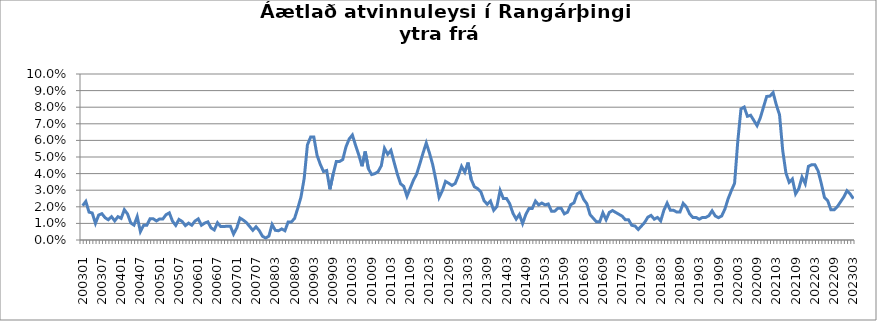
| Category | Series 0 |
|---|---|
| 200301 | 0.021 |
| 200302 | 0.023 |
| 200303 | 0.017 |
| 200304 | 0.016 |
| 200305 | 0.01 |
| 200306 | 0.015 |
| 200307 | 0.016 |
| 200308 | 0.013 |
| 200309 | 0.012 |
| 200310 | 0.014 |
| 200311 | 0.012 |
| 200312 | 0.014 |
| 200401 | 0.013 |
| 200402 | 0.018 |
| 200403 | 0.016 |
| 200404 | 0.01 |
| 200405 | 0.009 |
| 200406 | 0.014 |
| 200407 | 0.005 |
| 200408 | 0.009 |
| 200409 | 0.009 |
| 200410 | 0.013 |
| 200411 | 0.013 |
| 200412 | 0.011 |
| 200501 | 0.013 |
| 200502 | 0.013 |
| 200503 | 0.015 |
| 200504 | 0.016 |
| 200505 | 0.011 |
| 200506 | 0.009 |
| 200507 | 0.012 |
| 200508 | 0.011 |
| 200509 | 0.009 |
| 200510 | 0.01 |
| 200511 | 0.009 |
| 200512 | 0.011 |
| 200601 | 0.013 |
| 200602 | 0.009 |
| 200603 | 0.01 |
| 200604 | 0.011 |
| 200605 | 0.007 |
| 200606 | 0.006 |
| 200607 | 0.01 |
| 200608 | 0.008 |
| 200609 | 0.008 |
| 200610 | 0.008 |
| 200611 | 0.008 |
| 200612 | 0.004 |
| 200701 | 0.007 |
| 200702 | 0.013 |
| 200703 | 0.012 |
| 200704 | 0.011 |
| 200705 | 0.008 |
| 200706 | 0.006 |
| 200707 | 0.008 |
| 200708 | 0.006 |
| 200709 | 0.002 |
| 200710 | 0.001 |
| 200801 | 0.002 |
| 200802 | 0.009 |
| 200803 | 0.006 |
| 200804 | 0.006 |
| 200805 | 0.007 |
| 200806 | 0.006 |
| 200807 | 0.011 |
| 200808 | 0.011 |
| 200809 | 0.013 |
| 200810 | 0.019 |
| 200811 | 0.026 |
| 200812 | 0.037 |
| 200901 | 0.057 |
| 200902 | 0.062 |
| 200903 | 0.062 |
| 200904 | 0.051 |
| 200905 | 0.046 |
| 200906 | 0.041 |
| 200907 | 0.042 |
| 200908 | 0.031 |
| 200909 | 0.04 |
| 200910 | 0.047 |
| 200911 | 0.047 |
| 200912 | 0.048 |
| 201001 | 0.056 |
| 201002 | 0.061 |
| 201003 | 0.063 |
| 201004 | 0.057 |
| 201005 | 0.051 |
| 201006 | 0.044 |
| 201007 | 0.053 |
| 201008 | 0.043 |
| 201009 | 0.039 |
| 201010 | 0.04 |
| 201011 | 0.041 |
| 201012 | 0.045 |
| 201101 | 0.055 |
| 201102 | 0.052 |
| 201103 | 0.054 |
| 201104 | 0.047 |
| 201105 | 0.04 |
| 201106 | 0.034 |
| 201107 | 0.032 |
| 201108 | 0.026 |
| 201109 | 0.031 |
| 201110 | 0.036 |
| 201111 | 0.04 |
| 201112 | 0.046 |
| 201201 | 0.052 |
| 201202 | 0.058 |
| 201203 | 0.052 |
| 201204 | 0.045 |
| 201205 | 0.036 |
| 201206 | 0.026 |
| 201207 | 0.03 |
| 201208 | 0.035 |
| 201209 | 0.034 |
| 201210 | 0.033 |
| 201211 | 0.034 |
| 201212 | 0.039 |
| 201301 | 0.044 |
| 201302 | 0.041 |
| 201303 | 0.047 |
| 201304 | 0.036 |
| 201305 | 0.032 |
| 201306 | 0.031 |
| 201307 | 0.029 |
| 201308 | 0.024 |
| 201309 | 0.022 |
| 201310 | 0.023 |
| 201311 | 0.018 |
| 201312 | 0.02 |
| 201401 | 0.03 |
| 201402 | 0.025 |
| 201403 | 0.025 |
| 201404 | 0.022 |
| 201405 | 0.016 |
| 201406 | 0.013 |
| 201407 | 0.015 |
| 201408 | 0.01 |
| 201409 | 0.015 |
| 201410 | 0.019 |
| 201411 | 0.019 |
| 201412 | 0.023 |
| 201501 | 0.021 |
| 201502 | 0.022 |
| 201503 | 0.021 |
| 201504 | 0.022 |
| 201505 | 0.017 |
| 201506 | 0.017 |
| 201507 | 0.019 |
| 201508 | 0.019 |
| 201509 | 0.016 |
| 201510 | 0.017 |
| 201511 | 0.021 |
| 201512 | 0.022 |
| 201601 | 0.028 |
| 201602 | 0.029 |
| 201603 | 0.024 |
| 201604 | 0.022 |
| 201605 | 0.015 |
| 201606 | 0.013 |
| 201607 | 0.011 |
| 201608 | 0.011 |
| 201609 | 0.016 |
| 201610 | 0.012 |
| 201611 | 0.017 |
| 201612 | 0.018 |
| 201701 | 0.017 |
| 201702 | 0.015 |
| 201703 | 0.014 |
| 201704 | 0.012 |
| 201705 | 0.012 |
| 201706 | 0.009 |
| 201707 | 0.008 |
| 201708 | 0.006 |
| 201709 | 0.008 |
| 201710 | 0.011 |
| 201711 | 0.014 |
| 201712 | 0.015 |
| 201801 | 0.013 |
| 201802 | 0.014 |
| 201803 | 0.012 |
| 201804 | 0.018 |
| 201805 | 0.022 |
| 201806 | 0.018 |
| 201807 | 0.018 |
| 201808 | 0.017 |
| 201809 | 0.017 |
| 201810 | 0.022 |
| 201811 | 0.02 |
| 201812 | 0.016 |
| 201901 | 0.014 |
| 201902 | 0.014 |
| 201903 | 0.013 |
| 201904 | 0.014 |
| 201905 | 0.014 |
| 201906 | 0.015 |
| 201907 | 0.018 |
| 201908 | 0.014 |
| 201909 | 0.013 |
| 201910 | 0.015 |
| 201911 | 0.019 |
| 201912 | 0.025 |
| 202001 | 0.03 |
| 202002 | 0.034 |
| 202003 | 0.059 |
| 202004 | 0.079 |
| 202005 | 0.08 |
| 202006 | 0.075 |
| 202007 | 0.075 |
| 202008 | 0.072 |
| 202009 | 0.069 |
| 202010 | 0.074 |
| 202011 | 0.08 |
| 202012 | 0.086 |
| 202101 | 0.087 |
| 202102 | 0.089 |
| 202103 | 0.081 |
| 202104 | 0.075 |
| 202105 | 0.054 |
| 202106 | 0.04 |
| 202107 | 0.035 |
| 202108 | 0.037 |
| 202109 | 0.028 |
| 202110 | 0.031 |
| 202111 | 0.038 |
| 202112 | 0.034 |
| 202201 | 0.044 |
| 202202 | 0.045 |
| 202203 | 0.045 |
| 202204 | 0.042 |
| 202205 | 0.034 |
| 202206 | 0.026 |
| 202207 | 0.024 |
| 202208 | 0.018 |
| 202209 | 0.018 |
| 202210 | 0.02 |
| 202211 | 0.023 |
| 202212 | 0.026 |
| 202301 | 0.03 |
| 202302 | 0.028 |
| 202303 | 0.025 |